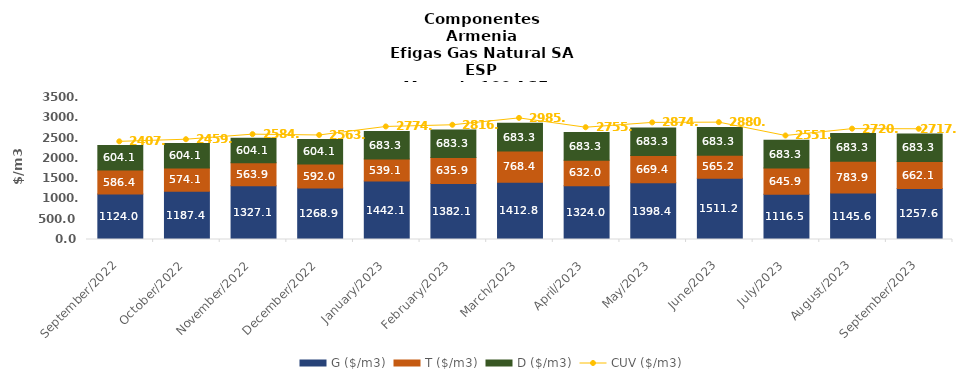
| Category | G ($/m3) | T ($/m3) | D ($/m3) |
|---|---|---|---|
| 2022-09-01 | 1123.97 | 586.38 | 604.09 |
| 2022-10-01 | 1187.44 | 574.12 | 604.09 |
| 2022-11-01 | 1327.14 | 563.85 | 604.09 |
| 2022-12-01 | 1268.91 | 592.03 | 604.09 |
| 2023-01-01 | 1442.084 | 539.064 | 683.343 |
| 2023-02-01 | 1382.137 | 635.944 | 683.343 |
| 2023-03-01 | 1412.843 | 768.353 | 683.343 |
| 2023-04-01 | 1324.021 | 631.998 | 683.343 |
| 2023-05-01 | 1398.419 | 669.403 | 683.343 |
| 2023-06-01 | 1511.242 | 565.219 | 683.343 |
| 2023-07-01 | 1116.463 | 645.939 | 683.343 |
| 2023-08-01 | 1145.565 | 783.894 | 683.343 |
| 2023-09-01 | 1257.568 | 662.12 | 683.343 |